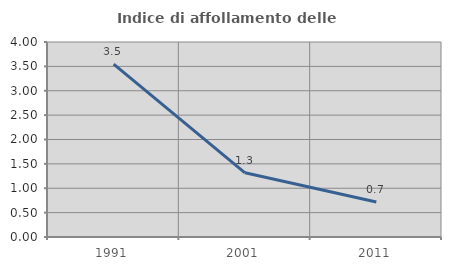
| Category | Indice di affollamento delle abitazioni  |
|---|---|
| 1991.0 | 3.546 |
| 2001.0 | 1.317 |
| 2011.0 | 0.717 |